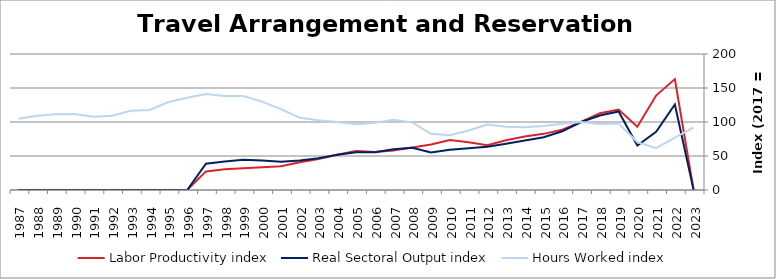
| Category | Labor Productivity index | Real Sectoral Output index | Hours Worked index |
|---|---|---|---|
| 2023.0 | 0 | 0 | 92.032 |
| 2022.0 | 163.071 | 125.811 | 77.151 |
| 2021.0 | 138.811 | 85.517 | 61.607 |
| 2020.0 | 92.969 | 65.496 | 70.45 |
| 2019.0 | 118.233 | 115.431 | 97.63 |
| 2018.0 | 112.78 | 109.44 | 97.038 |
| 2017.0 | 100 | 100 | 100 |
| 2016.0 | 88.666 | 86.408 | 97.454 |
| 2015.0 | 82.556 | 77.599 | 93.995 |
| 2014.0 | 78.749 | 72.669 | 92.279 |
| 2013.0 | 73.19 | 68.081 | 93.02 |
| 2012.0 | 65.942 | 63.579 | 96.417 |
| 2011.0 | 70.225 | 61.418 | 87.458 |
| 2010.0 | 73.42 | 59.056 | 80.436 |
| 2009.0 | 66.896 | 55.303 | 82.67 |
| 2008.0 | 62.524 | 62.13 | 99.37 |
| 2007.0 | 58.157 | 60.009 | 103.184 |
| 2006.0 | 56.029 | 55.46 | 98.984 |
| 2005.0 | 57.455 | 55.605 | 96.78 |
| 2004.0 | 51.716 | 51.745 | 100.058 |
| 2003.0 | 45.706 | 46.812 | 102.421 |
| 2002.0 | 40.72 | 43.319 | 106.383 |
| 2001.0 | 34.818 | 41.449 | 119.046 |
| 2000.0 | 33.495 | 43.54 | 129.99 |
| 1999.0 | 32.101 | 44.35 | 138.158 |
| 1998.0 | 30.409 | 42.06 | 138.317 |
| 1997.0 | 27.372 | 38.664 | 141.256 |
| 1996.0 | 0 | 0 | 135.71 |
| 1995.0 | 0 | 0 | 129.318 |
| 1994.0 | 0 | 0 | 117.808 |
| 1993.0 | 0 | 0 | 116.58 |
| 1992.0 | 0 | 0 | 109.136 |
| 1991.0 | 0 | 0 | 107.65 |
| 1990.0 | 0 | 0 | 111.842 |
| 1989.0 | 0 | 0 | 111.507 |
| 1988.0 | 0 | 0 | 109.352 |
| 1987.0 | 0 | 0 | 104.679 |